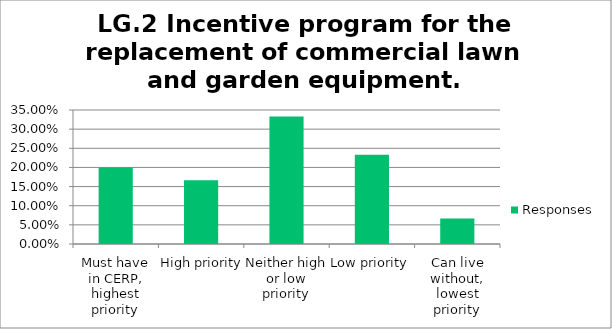
| Category | Responses |
|---|---|
| Must have in CERP, highest priority | 0.2 |
| High priority | 0.167 |
| Neither high or low priority | 0.333 |
| Low priority | 0.233 |
| Can live without, lowest priority | 0.067 |